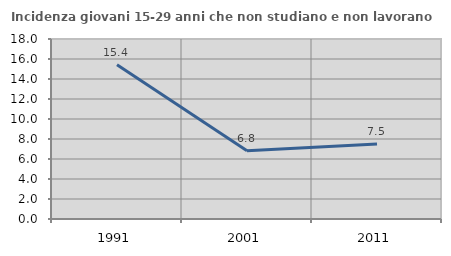
| Category | Incidenza giovani 15-29 anni che non studiano e non lavorano  |
|---|---|
| 1991.0 | 15.436 |
| 2001.0 | 6.818 |
| 2011.0 | 7.5 |